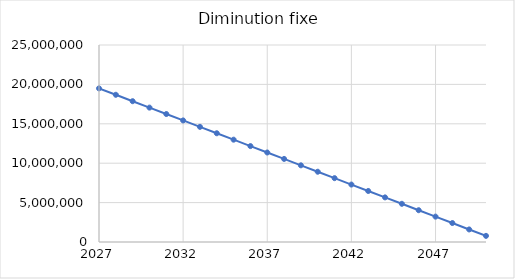
| Category | Diminution fixe |
|---|---|
| 2027.0 | 19495584 |
| 2028.0 | 18681828.174 |
| 2029.0 | 17868072.348 |
| 2030.0 | 17054316.522 |
| 2031.0 | 16240560.696 |
| 2032.0 | 15426804.87 |
| 2033.0 | 14613049.043 |
| 2034.0 | 13799293.217 |
| 2035.0 | 12985537.391 |
| 2036.0 | 12171781.565 |
| 2037.0 | 11358025.739 |
| 2038.0 | 10544269.913 |
| 2039.0 | 9730514.087 |
| 2040.0 | 8916758.261 |
| 2041.0 | 8103002.435 |
| 2042.0 | 7289246.609 |
| 2043.0 | 6475490.783 |
| 2044.0 | 5661734.957 |
| 2045.0 | 4847979.13 |
| 2046.0 | 4034223.304 |
| 2047.0 | 3220467.478 |
| 2048.0 | 2406711.652 |
| 2049.0 | 1592955.826 |
| 2050.0 | 779200 |